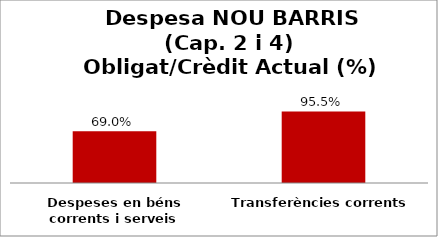
| Category | Series 0 |
|---|---|
| Despeses en béns corrents i serveis | 0.69 |
| Transferències corrents | 0.955 |